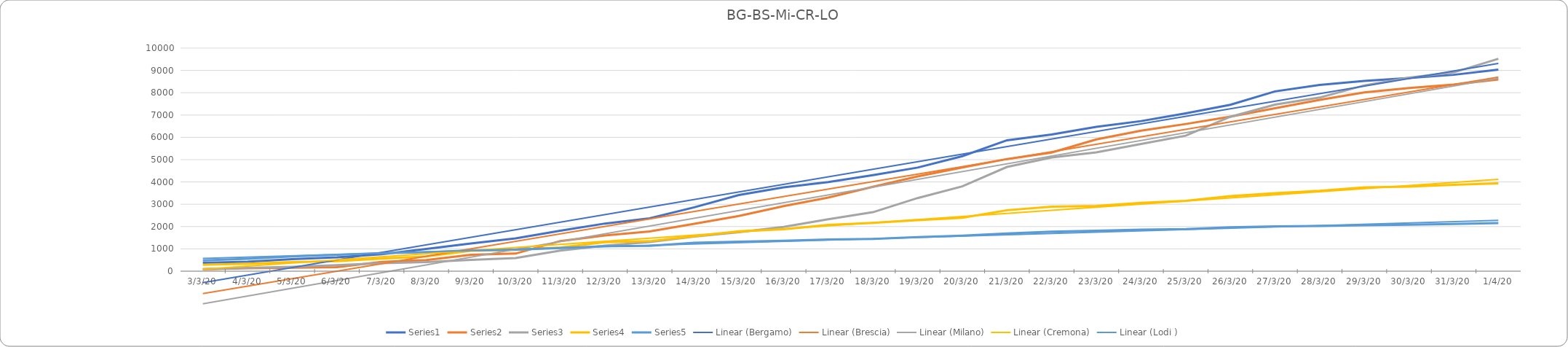
| Category | Series 0 | Series 1 | Series 2 | Series 3 | Series 4 |
|---|---|---|---|---|---|
| 2020-03-03 | 372 | 86 | 93 | 287 | 482 |
| 2020-03-04 | 423 | 127 | 145 | 333 | 559 |
| 2020-03-05 | 537 | 155 | 197 | 406 | 658 |
| 2020-03-06 | 623 | 182 | 267 | 452 | 739 |
| 2020-03-07 | 761 | 413 | 361 | 562 | 811 |
| 2020-03-08 | 997 | 501 | 406 | 665 | 853 |
| 2020-03-09 | 1245 | 739 | 506 | 916 | 928 |
| 2020-03-10 | 1472 | 790 | 592 | 957 | 963 |
| 2020-03-11 | 1815 | 1351 | 925 | 1061 | 1035 |
| 2020-03-12 | 2136 | 1598 | 1146 | 1302 | 1123 |
| 2020-03-13 | 2368 | 1784 | 1307 | 1344 | 1133 |
| 2020-03-14 | 2864 | 2122 | 1551 | 1565 | 1276 |
| 2020-03-15 | 3416 | 2473 | 1750 | 1792 | 1320 |
| 2020-03-16 | 3760 | 2918 | 1983 | 1881 | 1363 |
| 2020-03-17 | 3993 | 3300 | 2326 | 2073 | 1418 |
| 2020-03-18 | 4305 | 3784 | 2644 | 2167 | 1445 |
| 2020-03-19 | 4645 | 4247 | 3278 | 2286 | 1528 |
| 2020-03-20 | 5154 | 4648 | 3804 | 2392 | 1597 |
| 2020-03-21 | 5869 | 5028 | 4672 | 2733 | 1693 |
| 2020-03-22 | 6126 | 5317 | 5096 | 2895 | 1772 |
| 2020-03-23 | 6471 | 5905 | 5326 | 2925 | 1817 |
| 2020-03-24 | 6728 | 6298 | 5701 | 3061 | 1860 |
| 2020-03-25 | 7072 | 6597 | 6074 | 3156 | 1884 |
| 2020-03-26 | 7458 | 6931 | 6922 | 3370 | 1968 |
| 2020-03-27 | 8060 | 7305 | 7469 | 3496 | 2006 |
| 2020-03-28 | 8349 | 7678 | 7783 | 3605 | 2029 |
| 2020-03-29 | 8527 | 8013 | 8329 | 3762 | 2058 |
| 2020-03-30 | 8664 | 8213 | 8676 | 3788 | 2087 |
| 2020-03-31 | 8803 | 8367 | 8911 | 3869 | 2116 |
| 2020-04-01 | 9039 | 8598 | 9522 | 3941 | 2157 |